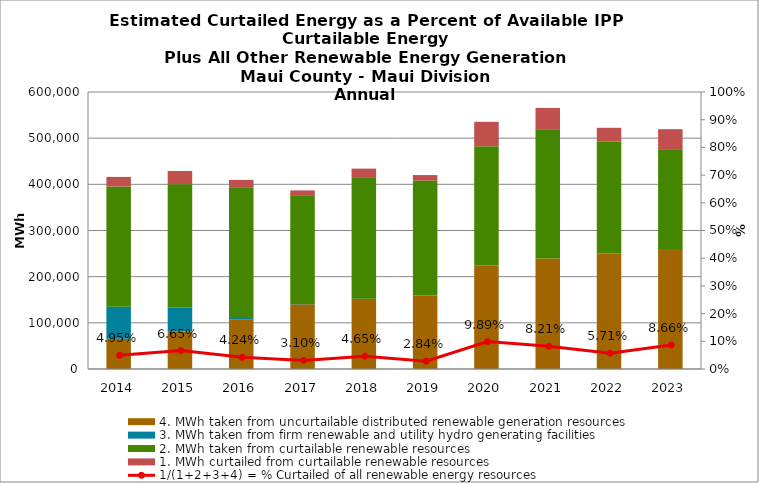
| Category | 4. MWh taken from uncurtailable distributed renewable generation resources | 3. MWh taken from firm renewable and utility hydro generating facilities | 2. MWh taken from curtailable renewable resources | 1. MWh curtailed from curtailable renewable resources |
|---|---|---|---|---|
| 2014.0 | 65393.339 | 69633.986 | 260448.469 | 20600.31 |
| 2015.0 | 81129.105 | 52437.572 | 266868 | 28509.88 |
| 2016.0 | 106702.083 | 5849.237 | 279696.793 | 17371.418 |
| 2017.0 | 140148.666 | 649.793 | 234075.023 | 11988.113 |
| 2018.0 | 152081.362 | 349.672 | 261421.805 | 20165.043 |
| 2019.0 | 159252.779 | 0 | 248899.516 | 11913.966 |
| 2020.0 | 224263.884 | 0 | 258207.35 | 52927.263 |
| 2021.0 | 239252.659 | 0 | 279812.267 | 46435.449 |
| 2022.0 | 250262.912 | 0 | 242334.495 | 29857.494 |
| 2023.0 | 259674.049 | 0 | 214835.73 | 44967.379 |